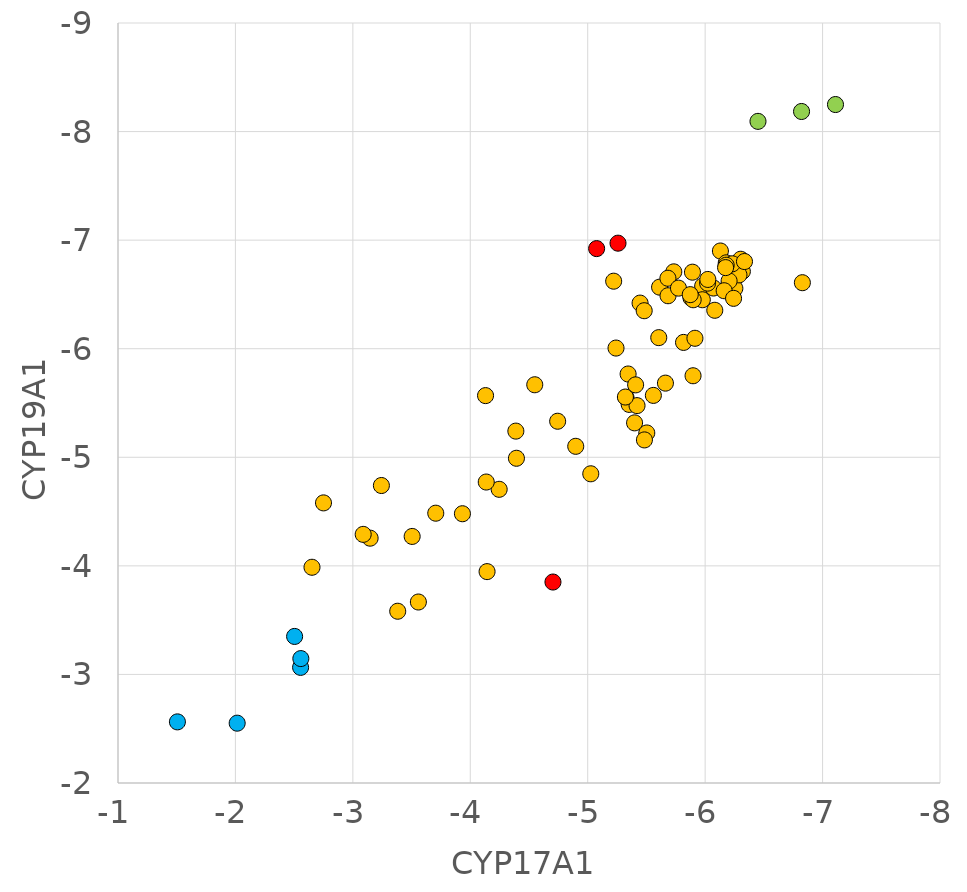
| Category | SP 3S79 |
|---|---|
| -7.11 | -8.249 |
| -6.821 | -8.185 |
| -6.45 | -8.094 |
| -5.446 | -6.42 |
| -6.828 | -6.608 |
| -6.13 | -6.9 |
| -5.979 | -6.578 |
| -6.303 | -6.824 |
| -5.816 | -6.058 |
| -5.605 | -6.102 |
| -6.2 | -6.581 |
| -6.18 | -6.791 |
| -6.317 | -6.712 |
| -5.897 | -5.751 |
| -6.202 | -6.579 |
| -6.071 | -6.559 |
| -6.253 | -6.556 |
| -5.258 | -6.972 |
| -5.612 | -6.567 |
| -6.288 | -6.68 |
| -6.204 | -6.624 |
| -6.231 | -6.782 |
| -5.892 | -6.705 |
| -5.913 | -6.096 |
| -5.733 | -6.708 |
| -5.976 | -6.451 |
| -5.88 | -6.467 |
| -5.399 | -5.317 |
| -6.179 | -6.769 |
| -6.162 | -6.534 |
| -5.326 | -5.551 |
| -5.241 | -6.006 |
| -5.559 | -5.57 |
| -4.744 | -5.332 |
| -6.021 | -6.604 |
| -6.023 | -6.638 |
| -5.684 | -6.488 |
| -5.221 | -6.622 |
| -6.335 | -6.803 |
| -5.898 | -6.451 |
| -5.026 | -4.848 |
| -5.353 | -5.487 |
| -4.549 | -5.668 |
| -6.174 | -6.747 |
| -5.344 | -5.767 |
| -5.683 | -6.649 |
| -5.503 | -5.224 |
| -5.481 | -6.35 |
| -5.773 | -6.558 |
| -5.662 | -5.683 |
| -6.242 | -6.464 |
| -5.873 | -6.498 |
| -5.076 | -6.922 |
| -2.504 | -3.35 |
| -5.42 | -5.476 |
| -6.082 | -6.354 |
| -5.483 | -5.16 |
| -4.898 | -5.101 |
| -4.704 | -3.851 |
| -3.243 | -4.74 |
| -3.505 | -4.271 |
| -2.555 | -3.065 |
| -5.321 | -5.555 |
| -3.147 | -4.255 |
| -2.652 | -3.987 |
| -4.246 | -4.705 |
| -5.408 | -5.667 |
| -4.136 | -4.772 |
| -4.13 | -5.568 |
| -4.393 | -4.991 |
| -4.388 | -5.241 |
| -1.506 | -2.563 |
| -2.557 | -3.146 |
| -3.933 | -4.48 |
| -2.015 | -2.551 |
| -3.088 | -4.29 |
| -2.75 | -4.58 |
| -3.706 | -4.485 |
| -4.143 | -3.947 |
| -3.558 | -3.667 |
| -3.382 | -3.582 |